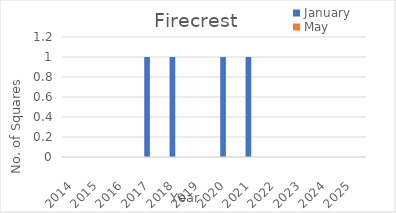
| Category | January | May |
|---|---|---|
| 2014.0 | 0 | 0 |
| 2015.0 | 0 | 0 |
| 2016.0 | 0 | 0 |
| 2017.0 | 1 | 0 |
| 2018.0 | 1 | 0 |
| 2019.0 | 0 | 0 |
| 2020.0 | 1 | 0 |
| 2021.0 | 1 | 0 |
| 2022.0 | 0 | 0 |
| 2023.0 | 0 | 0 |
| 2024.0 | 0 | 0 |
| 2025.0 | 0 | 0 |